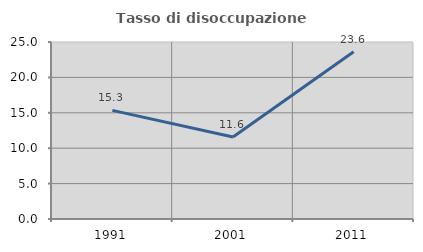
| Category | Tasso di disoccupazione giovanile  |
|---|---|
| 1991.0 | 15.343 |
| 2001.0 | 11.581 |
| 2011.0 | 23.629 |